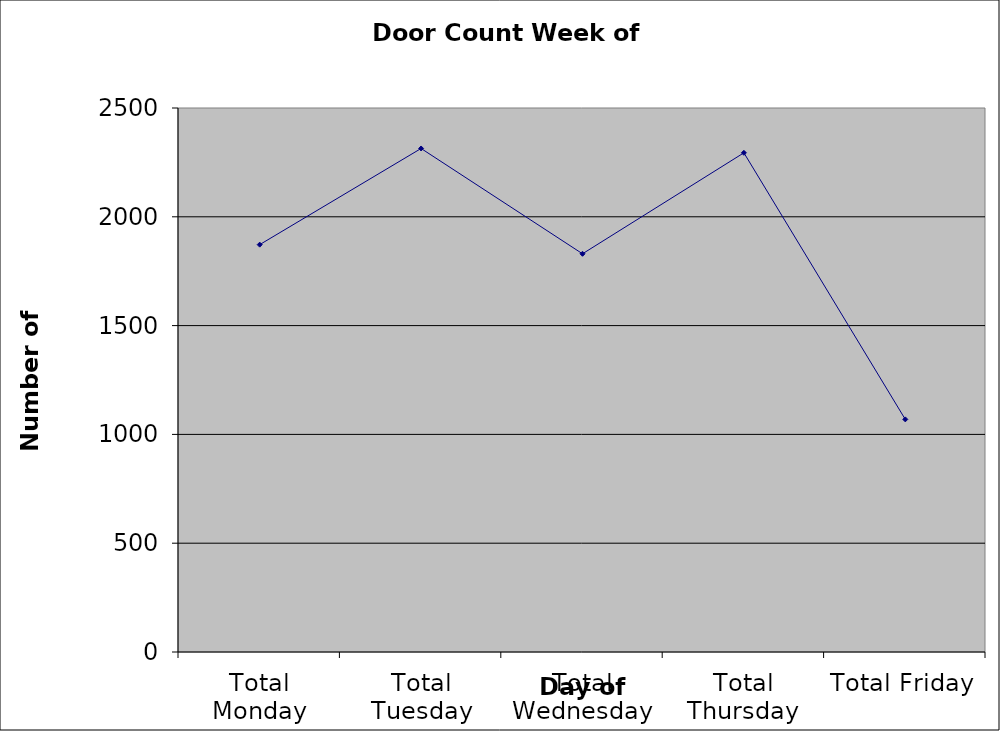
| Category | Series 0 |
|---|---|
| Total Monday | 1872 |
| Total Tuesday | 2314 |
| Total Wednesday | 1830 |
| Total Thursday | 2294 |
| Total Friday | 1069 |